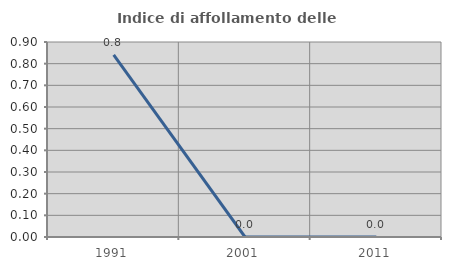
| Category | Indice di affollamento delle abitazioni  |
|---|---|
| 1991.0 | 0.84 |
| 2001.0 | 0 |
| 2011.0 | 0 |